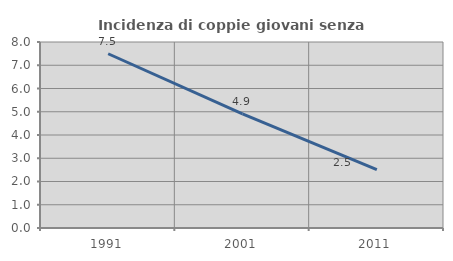
| Category | Incidenza di coppie giovani senza figli |
|---|---|
| 1991.0 | 7.495 |
| 2001.0 | 4.905 |
| 2011.0 | 2.509 |